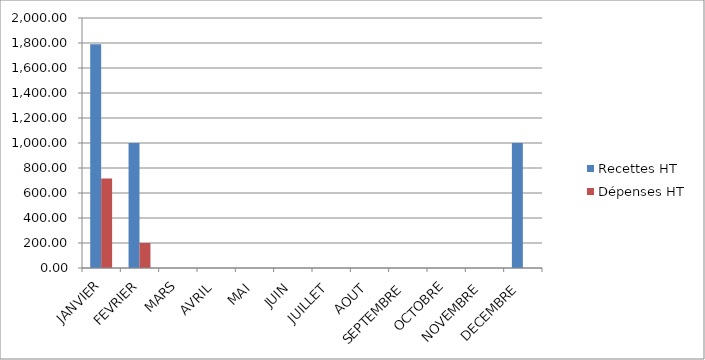
| Category | Recettes HT | Dépenses HT |
|---|---|---|
| JANVIER | 1790 | 716 |
| FEVRIER | 1000 | 200 |
| MARS | 0 | 0 |
| AVRIL | 0 | 0 |
| MAI | 0 | 0 |
| JUIN | 0 | 0 |
| JUILLET | 0 | 0 |
| AOUT | 0 | 0 |
| SEPTEMBRE | 0 | 0 |
| OCTOBRE | 0 | 0 |
| NOVEMBRE | 0 | 0 |
| DECEMBRE | 1000 | 0 |